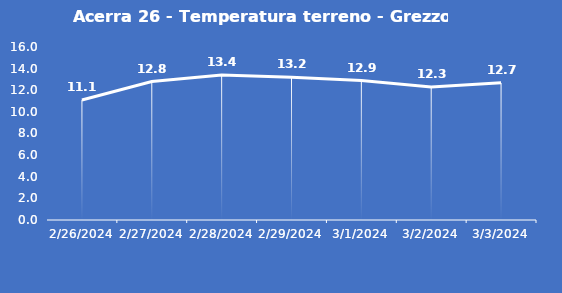
| Category | Acerra 26 - Temperatura terreno - Grezzo (°C) |
|---|---|
| 2/26/24 | 11.1 |
| 2/27/24 | 12.8 |
| 2/28/24 | 13.4 |
| 2/29/24 | 13.2 |
| 3/1/24 | 12.9 |
| 3/2/24 | 12.3 |
| 3/3/24 | 12.7 |